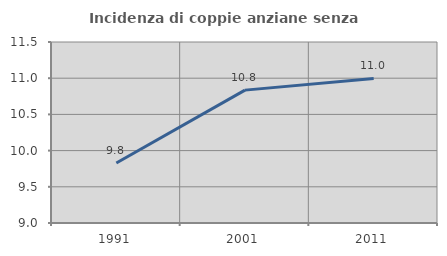
| Category | Incidenza di coppie anziane senza figli  |
|---|---|
| 1991.0 | 9.83 |
| 2001.0 | 10.835 |
| 2011.0 | 10.996 |